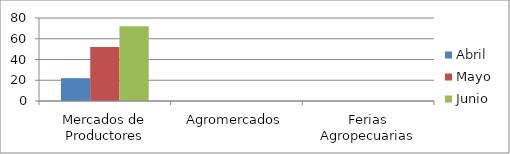
| Category | Abril | Mayo | Junio |
|---|---|---|---|
| Mercados de Productores | 22 | 52 | 72 |
| Agromercados | 0 | 0 | 0 |
| Ferias Agropecuarias | 0 | 0 | 0 |